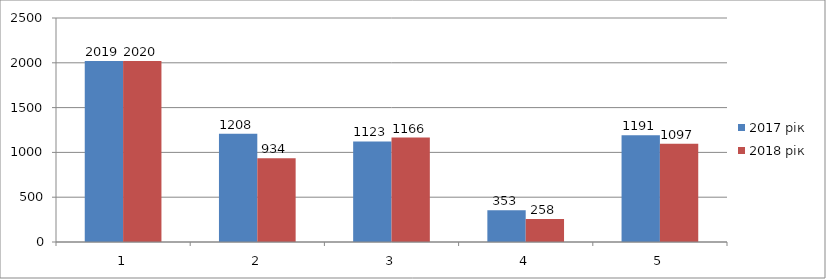
| Category | 2017 рік | 2018 рік |
|---|---|---|
| 0 | 2019 | 2020 |
| 1 | 1208 | 934 |
| 2 | 1123 | 1166 |
| 3 | 353 | 258 |
| 4 | 1191 | 1097 |